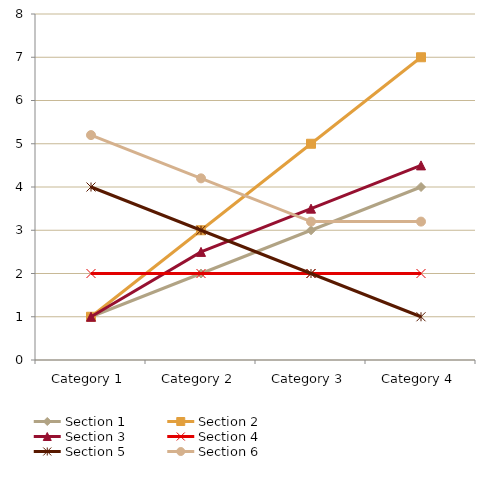
| Category | Section 1 | Section 2 | Section 3 | Section 4 | Section 5 | Section 6 |
|---|---|---|---|---|---|---|
| Category 1 | 1 | 1 | 1 | 2 | 4 | 5.2 |
| Category 2 | 2 | 3 | 2.5 | 2 | 3 | 4.2 |
| Category 3 | 3 | 5 | 3.5 | 2 | 2 | 3.2 |
| Category 4 | 4 | 7 | 4.5 | 2 | 1 | 3.2 |